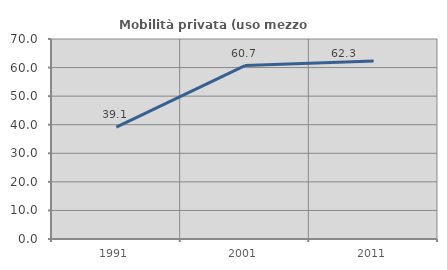
| Category | Mobilità privata (uso mezzo privato) |
|---|---|
| 1991.0 | 39.147 |
| 2001.0 | 60.702 |
| 2011.0 | 62.304 |